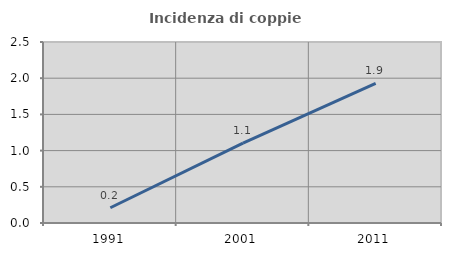
| Category | Incidenza di coppie miste |
|---|---|
| 1991.0 | 0.21 |
| 2001.0 | 1.102 |
| 2011.0 | 1.93 |